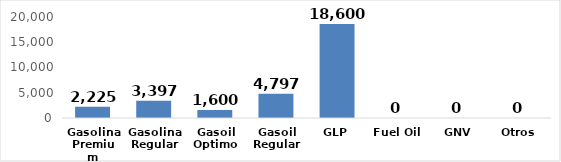
| Category | Series 0 |
|---|---|
| Gasolina Premium | 2225 |
| Gasolina Regular | 3397 |
| Gasoil Optimo | 1600 |
| Gasoil Regular | 4797 |
| GLP | 18600 |
| Fuel Oil  | 0 |
| GNV | 0 |
| Otros | 0 |